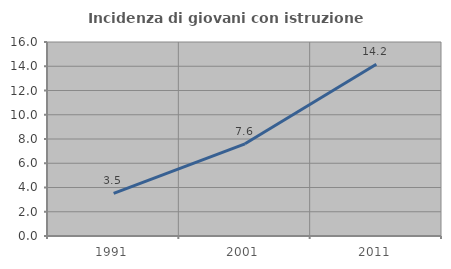
| Category | Incidenza di giovani con istruzione universitaria |
|---|---|
| 1991.0 | 3.509 |
| 2001.0 | 7.602 |
| 2011.0 | 14.167 |